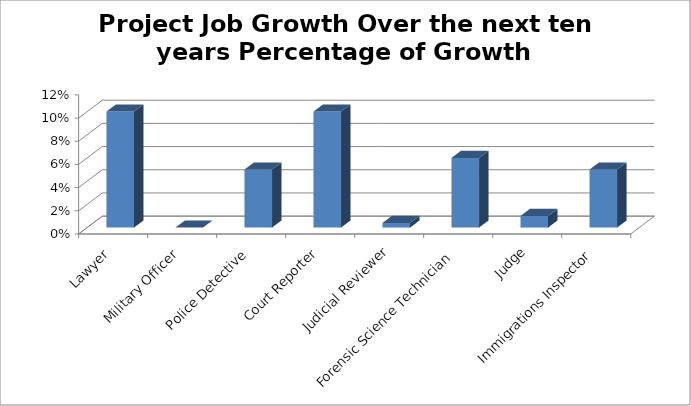
| Category |  Project Job Growth Over the next ten years Percentage of Growth |
|---|---|
| Lawyer | 0.1 |
| Military Officer | 0 |
| Police Detective | 0.05 |
| Court Reporter | 0.1 |
| Judicial Reviewer | 0.004 |
| Forensic Science Technician | 0.06 |
| Judge | 0.01 |
| Immigrations Inspector | 0.05 |